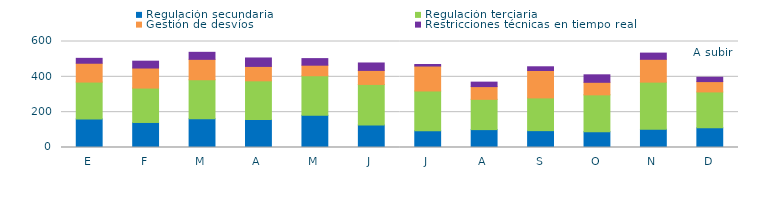
| Category | Regulación secundaria | Regulación terciaria | Gestión de desvíos | Restricciones técnicas en tiempo real |
|---|---|---|---|---|
| E | 161.861 | 208.495 | 106.599 | 27.713 |
| F | 141.676 | 194.7 | 113.499 | 38.769 |
| M | 162.745 | 220.776 | 115.478 | 39.763 |
| A | 158.011 | 219.35 | 81.587 | 47.756 |
| M | 182.307 | 223.89 | 59.699 | 37.271 |
| J | 127.444 | 229.57 | 79.28 | 42.128 |
| J | 94.844 | 225.119 | 141.128 | 8.662 |
| A | 101.249 | 171.399 | 72.097 | 25.26 |
| S | 95.453 | 185.258 | 155.2 | 20.99 |
| O | 89.66 | 208.368 | 70.97 | 42.425 |
| N | 103.081 | 266.927 | 129.246 | 35.082 |
| D | 111.655 | 202.904 | 58.5 | 24.632 |